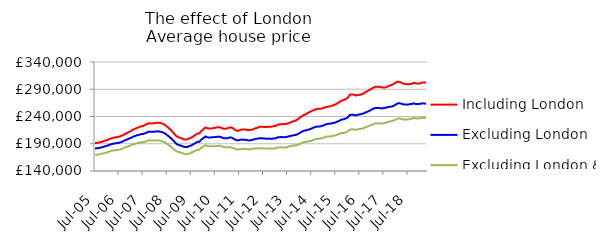
| Category | Including London | Excluding London | Excluding London & SE |
|---|---|---|---|
| 2005-07-01 | 191319.555 | 181363.223 | 169577.861 |
| 2005-08-01 | 191569.071 | 181663.906 | 169773.809 |
| 2005-09-01 | 192146.589 | 182211.46 | 170498.059 |
| 2005-10-01 | 193274.487 | 183205.076 | 171500.937 |
| 2005-11-01 | 194204.629 | 183996.189 | 172196.059 |
| 2005-12-01 | 195787.179 | 185297.211 | 173286.403 |
| 2006-01-01 | 196789.447 | 186236.069 | 174043.793 |
| 2006-02-01 | 198441.023 | 187746.135 | 175475.934 |
| 2006-03-01 | 199612.645 | 189007.534 | 176665.242 |
| 2006-04-01 | 200830.649 | 190048.08 | 177539.192 |
| 2006-05-01 | 201614.139 | 190720.678 | 177999.506 |
| 2006-06-01 | 202207.347 | 191154.626 | 178416.944 |
| 2006-07-01 | 203075.969 | 191911.497 | 178998.086 |
| 2006-08-01 | 204234.21 | 192976.808 | 180129.093 |
| 2006-09-01 | 205945.735 | 194506.961 | 181512.629 |
| 2006-10-01 | 207990.011 | 196503.2 | 183464.776 |
| 2006-11-01 | 209617.09 | 197788.138 | 184556.045 |
| 2006-12-01 | 211765.837 | 199547.245 | 186159.007 |
| 2007-01-01 | 213538.029 | 200888.778 | 187234.731 |
| 2007-02-01 | 216107.841 | 203090.719 | 189119.82 |
| 2007-03-01 | 217479.29 | 204206.955 | 189903.109 |
| 2007-04-01 | 219272.042 | 205733.165 | 191179.243 |
| 2007-05-01 | 220315.078 | 206473.431 | 191874.553 |
| 2007-06-01 | 222009.115 | 207631.015 | 192584.121 |
| 2007-07-01 | 222687.123 | 207845.83 | 192719.934 |
| 2007-08-01 | 224460.722 | 209254.501 | 193741.281 |
| 2007-09-01 | 226227.808 | 210904.551 | 195289.3 |
| 2007-10-01 | 227540.609 | 212207.423 | 196426.413 |
| 2007-11-01 | 227284.839 | 212038.615 | 196027.98 |
| 2007-12-01 | 227433.413 | 212108.47 | 195944.942 |
| 2008-01-01 | 227827.129 | 212220.228 | 195600.391 |
| 2008-02-01 | 228741.432 | 212897.578 | 196372.677 |
| 2008-03-01 | 228118.902 | 212359.627 | 195781.273 |
| 2008-04-01 | 227674.481 | 211917.335 | 195481.102 |
| 2008-05-01 | 226200.506 | 210489.594 | 193793.526 |
| 2008-06-01 | 224434.589 | 208793.105 | 192297.391 |
| 2008-07-01 | 221197.984 | 205770.019 | 189482.842 |
| 2008-08-01 | 218181.885 | 202929.6 | 186927.504 |
| 2008-09-01 | 214541.399 | 199672.957 | 183840.851 |
| 2008-10-01 | 210634.505 | 196058.716 | 180880.002 |
| 2008-11-01 | 206130.652 | 192054.369 | 177773.933 |
| 2008-12-01 | 202930.031 | 188805.163 | 175508.108 |
| 2009-01-01 | 201447.291 | 187498.362 | 174663.703 |
| 2009-02-01 | 200195.627 | 186308.273 | 173493.733 |
| 2009-03-01 | 198543.307 | 184863.342 | 172082.437 |
| 2009-04-01 | 197695.062 | 184066.841 | 170850.448 |
| 2009-05-01 | 198115.164 | 184110.598 | 170923.325 |
| 2009-06-01 | 199629.16 | 185513.567 | 172047.728 |
| 2009-07-01 | 201223.033 | 186817.842 | 173425.456 |
| 2009-08-01 | 203501.941 | 189001.241 | 175263.04 |
| 2009-09-01 | 206187.319 | 191099.059 | 176970.293 |
| 2009-10-01 | 208584.386 | 193400.951 | 178892.775 |
| 2009-11-01 | 209002.713 | 193637.566 | 179183.593 |
| 2009-12-01 | 213111.81 | 197542.806 | 182551.82 |
| 2010-01-01 | 216322.861 | 200239.35 | 184840.25 |
| 2010-02-01 | 219924.872 | 203265.605 | 187359.849 |
| 2010-03-01 | 218537.513 | 201853.369 | 185869.586 |
| 2010-04-01 | 217809.916 | 201363.788 | 185353.9 |
| 2010-05-01 | 217968.902 | 201704.1 | 185270.435 |
| 2010-06-01 | 218732.691 | 202016.474 | 185414.011 |
| 2010-07-01 | 219353.324 | 202250.683 | 185344.092 |
| 2010-08-01 | 220110.662 | 202797.965 | 185938.386 |
| 2010-09-01 | 220078.897 | 203000.142 | 186391.967 |
| 2010-10-01 | 219216.311 | 202112.182 | 185631.099 |
| 2010-11-01 | 217612.082 | 200298.636 | 183971.89 |
| 2010-12-01 | 217601.628 | 199923.161 | 183555.15 |
| 2011-01-01 | 218123.147 | 200224.721 | 183330.73 |
| 2011-02-01 | 219783.244 | 201404.213 | 183875.948 |
| 2011-03-01 | 219987.92 | 201287.48 | 183100.965 |
| 2011-04-01 | 217896.56 | 199482.111 | 182065.771 |
| 2011-05-01 | 215070.552 | 197413.974 | 180403.033 |
| 2011-06-01 | 213541.473 | 196297.673 | 179584.342 |
| 2011-07-01 | 214581.343 | 196769.929 | 179764.567 |
| 2011-08-01 | 216103.808 | 197695.271 | 180475.822 |
| 2011-09-01 | 216078.388 | 197429.6 | 180463.96 |
| 2011-10-01 | 216350.889 | 197484.834 | 180741.056 |
| 2011-11-01 | 215125.515 | 196239.672 | 179752.498 |
| 2011-12-01 | 215194.364 | 196098.597 | 179874.266 |
| 2012-01-01 | 215889.202 | 196728.144 | 180268.186 |
| 2012-02-01 | 216649.949 | 197609.111 | 181076.798 |
| 2012-03-01 | 218490.049 | 199060.489 | 181603.678 |
| 2012-04-01 | 219309.105 | 199176.146 | 181337.999 |
| 2012-05-01 | 221366.338 | 200235.295 | 181934.535 |
| 2012-06-01 | 221374.859 | 200086.051 | 181949.565 |
| 2012-07-01 | 221152.402 | 199757.968 | 181375.327 |
| 2012-08-01 | 220672.565 | 199469.659 | 181289.618 |
| 2012-09-01 | 220892.388 | 199095.344 | 181035.413 |
| 2012-10-01 | 221300.28 | 199450.673 | 181666.493 |
| 2012-11-01 | 221404.715 | 198937.548 | 180900.083 |
| 2012-12-01 | 222092.485 | 199715.394 | 181311.451 |
| 2013-01-01 | 222828.062 | 199933.632 | 181480.482 |
| 2013-02-01 | 224736.007 | 201822.452 | 183461.301 |
| 2013-03-01 | 225563.602 | 201977.613 | 183191.372 |
| 2013-04-01 | 226164.103 | 202364.225 | 183508.874 |
| 2013-05-01 | 225918.187 | 201888.781 | 182639.233 |
| 2013-06-01 | 226228.04 | 202251.962 | 183472.055 |
| 2013-07-01 | 227080.324 | 202950.162 | 184034.725 |
| 2013-08-01 | 228563.69 | 203933.536 | 185295.104 |
| 2013-09-01 | 230019.564 | 204781.125 | 186278.296 |
| 2013-10-01 | 231440.016 | 205654.073 | 186860.146 |
| 2013-11-01 | 232463.672 | 206023.868 | 186976.082 |
| 2013-12-01 | 234563.62 | 207574.684 | 187833.257 |
| 2014-01-01 | 237782.418 | 209709.628 | 189701.219 |
| 2014-02-01 | 240132.395 | 211793.754 | 191348.235 |
| 2014-03-01 | 242575.432 | 213716.528 | 192927.619 |
| 2014-04-01 | 243916.58 | 214500.879 | 193436.008 |
| 2014-05-01 | 246293.59 | 215607.367 | 194122.063 |
| 2014-06-01 | 248306.816 | 216508.788 | 194582.436 |
| 2014-07-01 | 249917.641 | 217994.792 | 195587.771 |
| 2014-08-01 | 251785.869 | 219777.821 | 197332.494 |
| 2014-09-01 | 253228.454 | 220822.763 | 198393.868 |
| 2014-10-01 | 254149.034 | 221705.548 | 199469.548 |
| 2014-11-01 | 254163.788 | 221684.198 | 199159.885 |
| 2014-12-01 | 254509.495 | 222536.241 | 200024.417 |
| 2015-01-01 | 255974.307 | 223865.5 | 201083.266 |
| 2015-02-01 | 257239.904 | 225450.234 | 202767.82 |
| 2015-03-01 | 257907.417 | 226386.74 | 203413.698 |
| 2015-04-01 | 258526.388 | 226699.489 | 203613.075 |
| 2015-05-01 | 259614.599 | 227419.188 | 203950.235 |
| 2015-06-01 | 261047.351 | 228228.532 | 204690.053 |
| 2015-07-01 | 262197.133 | 229268.766 | 205544.203 |
| 2015-08-01 | 264709.142 | 230973.755 | 207223.346 |
| 2015-09-01 | 266706.424 | 232466.585 | 208211.548 |
| 2015-10-01 | 269488.987 | 234601.743 | 209889.51 |
| 2015-11-01 | 270061.523 | 234836.945 | 209806.518 |
| 2015-12-01 | 272125.761 | 236484.399 | 211165.577 |
| 2016-01-01 | 274297.09 | 238072.341 | 212436.547 |
| 2016-02-01 | 279967.268 | 242906.497 | 216201.128 |
| 2016-03-01 | 280440.433 | 243052.858 | 216339.562 |
| 2016-04-01 | 280424.799 | 243193.613 | 216548.253 |
| 2016-05-01 | 278466.737 | 241694.991 | 215404.232 |
| 2016-06-01 | 279398.104 | 243258.539 | 216679.947 |
| 2016-07-01 | 279790.631 | 243915.326 | 217002.049 |
| 2016-08-01 | 280598.995 | 244742.345 | 217649.228 |
| 2016-09-01 | 282384.739 | 245666.381 | 218507.999 |
| 2016-10-01 | 285117.626 | 247783.63 | 220787.552 |
| 2016-11-01 | 286918.623 | 248903.494 | 221839.6 |
| 2016-12-01 | 289050.604 | 250904.224 | 223456.893 |
| 2017-01-01 | 291359.006 | 252865.757 | 224849.357 |
| 2017-02-01 | 293203.029 | 254679.849 | 226404.954 |
| 2017-03-01 | 294763.389 | 255770.278 | 227489.195 |
| 2017-04-01 | 294643.941 | 255379.868 | 227183.496 |
| 2017-05-01 | 294453.692 | 255352.794 | 227265.69 |
| 2017-06-01 | 293250.247 | 255005.166 | 227168.725 |
| 2017-07-01 | 293035.545 | 255458.531 | 227719.487 |
| 2017-08-01 | 293434.325 | 256243.114 | 228623.624 |
| 2017-09-01 | 295305.22 | 257195.089 | 229833.028 |
| 2017-10-01 | 296747.036 | 257940.765 | 230959.073 |
| 2017-11-01 | 297984.694 | 258344.015 | 231620.837 |
| 2017-12-01 | 299990.723 | 259858.689 | 232801.821 |
| 2018-01-01 | 302466.641 | 262061.235 | 234535.863 |
| 2018-02-01 | 303993.62 | 264168.438 | 236357.361 |
| 2018-03-01 | 303295.63 | 264094.398 | 236124.293 |
| 2018-04-01 | 301432.562 | 263361.825 | 235320.541 |
| 2018-05-01 | 299996.01 | 261908.376 | 234075.746 |
| 2018-06-01 | 299563.941 | 262209.494 | 234700.314 |
| 2018-07-01 | 298764.409 | 261656.618 | 234530.265 |
| 2018-08-01 | 299477.143 | 262723.204 | 235705.725 |
| 2018-09-01 | 300008.376 | 262981.449 | 236058.314 |
| 2018-10-01 | 301929.777 | 264069.289 | 237291.229 |
| 2018-11-01 | 300644.219 | 262894.336 | 236380.222 |
| 2018-12-01 | 300659.775 | 262972.74 | 236657.778 |
| 2019-01-01 | 300696.327 | 263130.9 | 236703.24 |
| 2019-02-01 | 302374.197 | 264171.042 | 237655.318 |
| 2019-03-01 | 302301.768 | 263847.039 | 237317.058 |
| 2019-04-01 | 302121.619 | 263509.216 | 237056.799 |